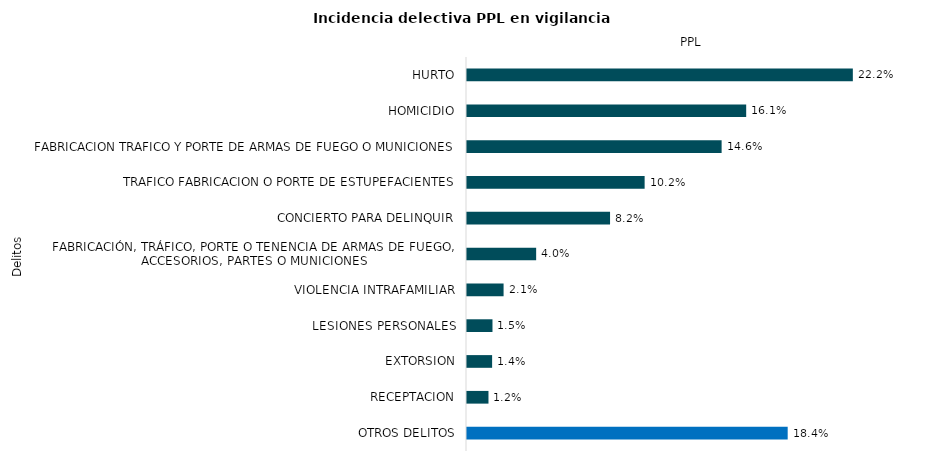
| Category | Series 0 |
|---|---|
| HURTO | 2120 |
| HOMICIDIO | 1534 |
| FABRICACION TRAFICO Y PORTE DE ARMAS DE FUEGO O MUNICIONES | 1399 |
| TRAFICO FABRICACION O PORTE DE ESTUPEFACIENTES | 976 |
| CONCIERTO PARA DELINQUIR | 786 |
| FABRICACIÓN, TRÁFICO, PORTE O TENENCIA DE ARMAS DE FUEGO, ACCESORIOS, PARTES O MUNICIONES | 380 |
| VIOLENCIA INTRAFAMILIAR | 201 |
| LESIONES PERSONALES | 140 |
| EXTORSION | 138 |
| RECEPTACION | 118 |
| OTROS DELITOS | 1762 |